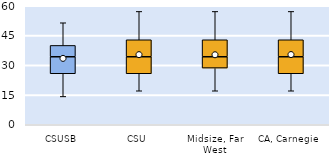
| Category | 25th | 50th | 75th |
|---|---|---|---|
| CSUSB | 25.714 | 8.571 | 5.714 |
| CSU | 25.714 | 8.571 | 8.571 |
| Midsize, Far West | 28.571 | 5.714 | 8.571 |
| CA, Carnegie | 25.714 | 8.571 | 8.571 |